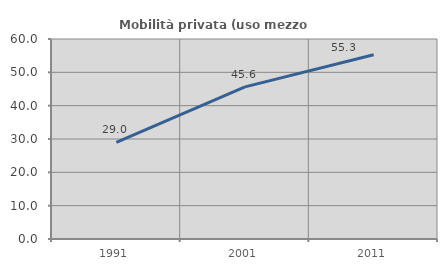
| Category | Mobilità privata (uso mezzo privato) |
|---|---|
| 1991.0 | 28.995 |
| 2001.0 | 45.625 |
| 2011.0 | 55.286 |